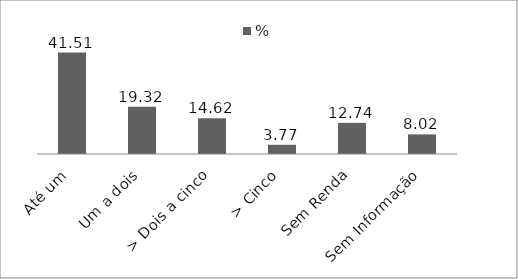
| Category | % |
|---|---|
| Até um | 41.51 |
| Um a dois | 19.32 |
| > Dois a cinco | 14.62 |
| > Cinco | 3.77 |
| Sem Renda | 12.74 |
| Sem Informação | 8.02 |